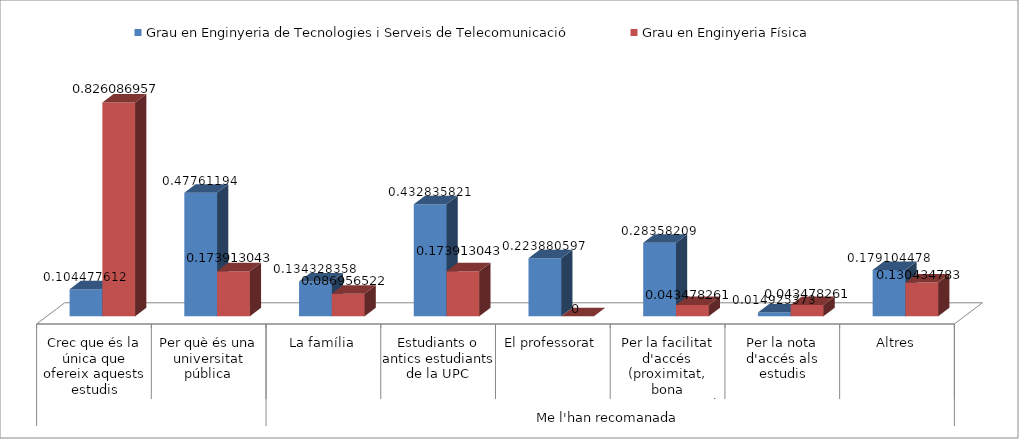
| Category | Grau en Enginyeria de Tecnologies i Serveis de Telecomunicació | Grau en Enginyeria Física |
|---|---|---|
| 0 | 0.104 | 0.826 |
| 1 | 0.478 | 0.174 |
| 2 | 0.134 | 0.087 |
| 3 | 0.433 | 0.174 |
| 4 | 0.224 | 0 |
| 5 | 0.284 | 0.043 |
| 6 | 0.015 | 0.043 |
| 7 | 0.179 | 0.13 |